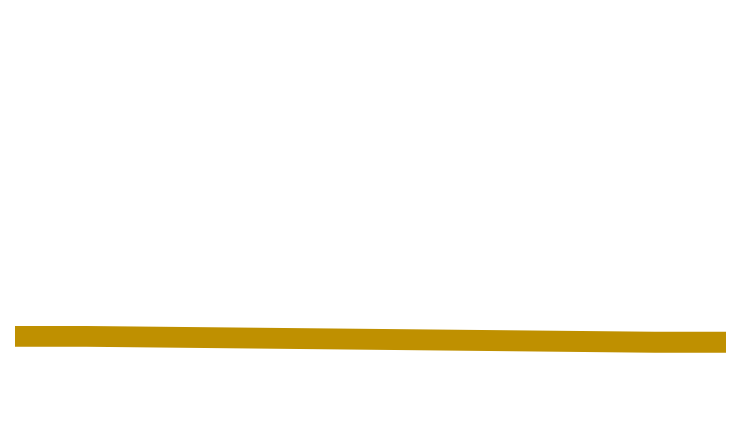
| Category | Series 0 | Series 1 | Series 2 |
|---|---|---|---|
| 0.0 | 2992.242 | 201.47 | 819.449 |
| 10.0 | 2992.242 | 201.47 | 819.449 |
| 90.0 | 3048.257 | 201.47 | 763.434 |
| 100.0 | 3048.257 | 201.47 | 763.434 |